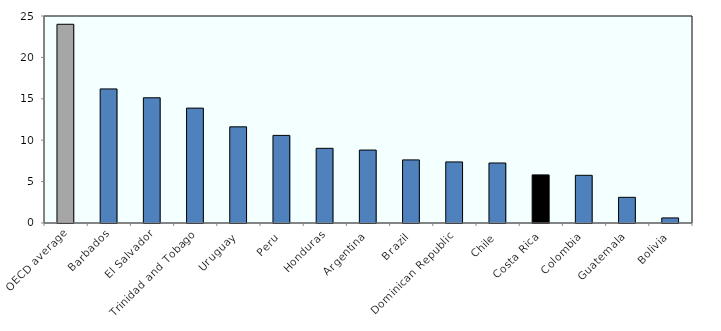
| Category | PIT as a share of total tax revenues in 2014 |
|---|---|
| OECD average | 24 |
| Barbados | 16.193 |
| El Salvador | 15.124 |
| Trinidad and Tobago | 13.874 |
| Uruguay | 11.612 |
| Peru | 10.58 |
| Honduras | 9.02 |
| Argentina | 8.81 |
| Brazil | 7.621 |
| Dominican Republic | 7.375 |
| Chile | 7.248 |
| Costa Rica | 5.808 |
| Colombia | 5.76 |
| Guatemala | 3.101 |
| Bolivia | 0.612 |